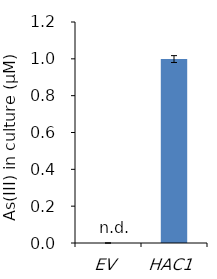
| Category | Series 0 |
|---|---|
| EV | 0 |
| HAC1 | 0.999 |